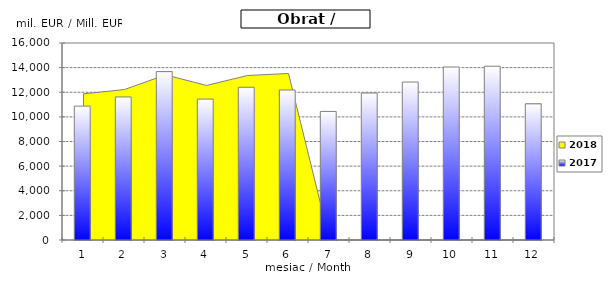
| Category | 2017 |
|---|---|
| 0 | 10873.548 |
| 1 | 11618.862 |
| 2 | 13674.165 |
| 3 | 11445.049 |
| 4 | 12404.528 |
| 5 | 12183.11 |
| 6 | 10443.452 |
| 7 | 11937.066 |
| 8 | 12828.724 |
| 9 | 14050.436 |
| 10 | 14115.232 |
| 11 | 11056.306 |